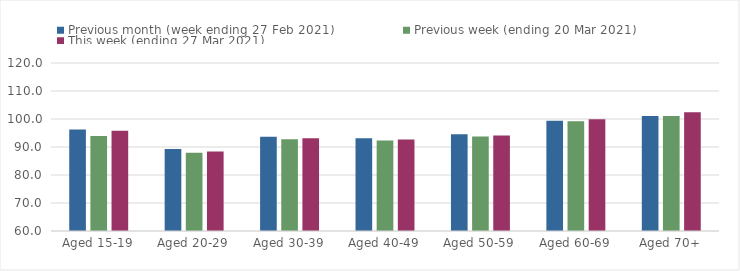
| Category | Previous month (week ending 27 Feb 2021) | Previous week (ending 20 Mar 2021) | This week (ending 27 Mar 2021) |
|---|---|---|---|
| Aged 15-19 | 96.24 | 93.93 | 95.78 |
| Aged 20-29 | 89.3 | 87.97 | 88.38 |
| Aged 30-39 | 93.63 | 92.8 | 93.13 |
| Aged 40-49 | 93.16 | 92.28 | 92.65 |
| Aged 50-59 | 94.57 | 93.79 | 94.1 |
| Aged 60-69 | 99.37 | 99.16 | 99.9 |
| Aged 70+ | 101.08 | 101.04 | 102.38 |